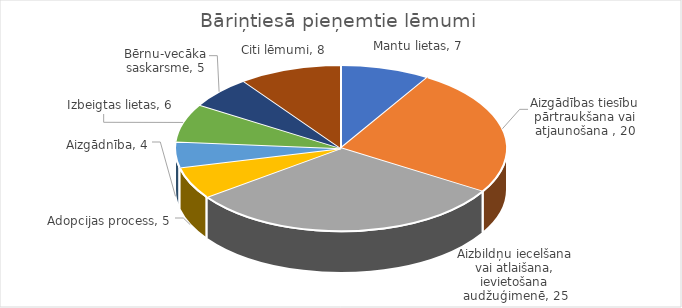
| Category | Skaits  |
|---|---|
| Mantu lietas | 7 |
| Aizgādības tiesību pārtraukšana vai atjaunošana  | 20 |
| Aizbildņu iecelšana vai atlaišana, ievietošana audžuģimenē | 25 |
| Adopcijas process | 5 |
| Aizgādnība | 4 |
| Izbeigtas lietas | 6 |
| Bērnu-vecāka saskarsme | 5 |
| Citi lēmumi | 8 |